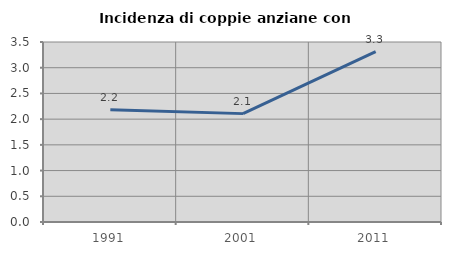
| Category | Incidenza di coppie anziane con figli |
|---|---|
| 1991.0 | 2.183 |
| 2001.0 | 2.107 |
| 2011.0 | 3.311 |